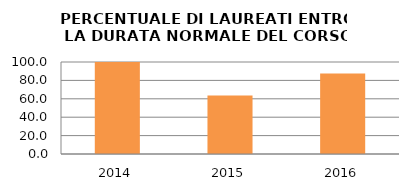
| Category | 2014 2015 2016 |
|---|---|
| 2014.0 | 100 |
| 2015.0 | 63.636 |
| 2016.0 | 87.5 |